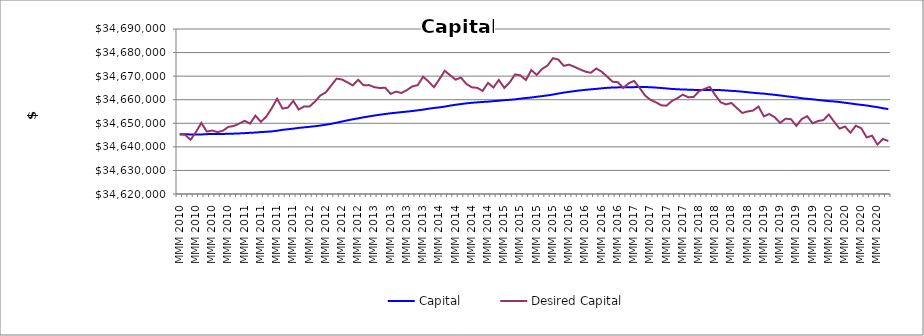
| Category | Capital | Desired Capital |
|---|---|---|
| MMM 2010 | 34645298.422 | 34645298.422 |
| MMM 2010 | 34645298.422 | 34645128.491 |
| MMM 2010 | 34645293.702 | 34642982.798 |
| MMM 2010 | 34645229.51 | 34646280.02 |
| MMM 2010 | 34645258.691 | 34650183.664 |
| MMM 2010 | 34645395.496 | 34646485.161 |
| MMM 2010 | 34645425.764 | 34646929.41 |
| MMM 2010 | 34645467.532 | 34646263.54 |
| MMM 2010 | 34645489.643 | 34646864.684 |
| MMM 2010 | 34645527.839 | 34648481.085 |
| MMM 2010 | 34645609.873 | 34648855.1 |
| MMM 2010 | 34645700.019 | 34649867.607 |
| MMM 2011 | 34645815.785 | 34651049.634 |
| MMM 2011 | 34645961.17 | 34649869.801 |
| MMM 2011 | 34646069.743 | 34653249.377 |
| MMM 2011 | 34646269.177 | 34650607.617 |
| MMM 2011 | 34646389.689 | 34652809.703 |
| MMM 2011 | 34646568.023 | 34656338.591 |
| MMM 2011 | 34646839.428 | 34660429.334 |
| MMM 2011 | 34647216.925 | 34656244.126 |
| MMM 2011 | 34647467.681 | 34656637.115 |
| MMM 2011 | 34647722.387 | 34659514.752 |
| MMM 2011 | 34648049.953 | 34655840.358 |
| MMM 2011 | 34648266.353 | 34657139.008 |
| MMM 2012 | 34648512.816 | 34657108.351 |
| MMM 2012 | 34648751.58 | 34659202.632 |
| MMM 2012 | 34649041.887 | 34661801.72 |
| MMM 2012 | 34649396.327 | 34663089.624 |
| MMM 2012 | 34649776.697 | 34666015.426 |
| MMM 2012 | 34650227.772 | 34668937.724 |
| MMM 2012 | 34650747.493 | 34668574.208 |
| MMM 2012 | 34651242.68 | 34667390.611 |
| MMM 2012 | 34651691.233 | 34666067.803 |
| MMM 2012 | 34652090.583 | 34668438.253 |
| MMM 2012 | 34652544.685 | 34666102.008 |
| MMM 2012 | 34652921.277 | 34666207.002 |
| MMM 2013 | 34653290.325 | 34665310.318 |
| MMM 2013 | 34653624.214 | 34664970.948 |
| MMM 2013 | 34653939.401 | 34665080.668 |
| MMM 2013 | 34654248.88 | 34662485.43 |
| MMM 2013 | 34654477.673 | 34663445.601 |
| MMM 2013 | 34654726.782 | 34662850.014 |
| MMM 2013 | 34654952.428 | 34664077.179 |
| MMM 2013 | 34655205.893 | 34665632.373 |
| MMM 2013 | 34655495.517 | 34666174.793 |
| MMM 2013 | 34655792.164 | 34669755.631 |
| MMM 2013 | 34656180.038 | 34667724.118 |
| MMM 2013 | 34656500.707 | 34665293.195 |
| MMM 2014 | 34656744.943 | 34668651.455 |
| MMM 2014 | 34657075.679 | 34672280.743 |
| MMM 2014 | 34657498.042 | 34670370.632 |
| MMM 2014 | 34657855.614 | 34668512.235 |
| MMM 2014 | 34658151.631 | 34669371.776 |
| MMM 2014 | 34658463.302 | 34666686.207 |
| MMM 2014 | 34658691.716 | 34665255.263 |
| MMM 2014 | 34658874.037 | 34665055.789 |
| MMM 2014 | 34659045.752 | 34663752.429 |
| MMM 2014 | 34659176.493 | 34667144.973 |
| MMM 2014 | 34659397.84 | 34665177.789 |
| MMM 2014 | 34659558.394 | 34668380.713 |
| MMM 2015 | 34659803.458 | 34665006.274 |
| MMM 2015 | 34659947.981 | 34667332.683 |
| MMM 2015 | 34660153.112 | 34670751.392 |
| MMM 2015 | 34660447.508 | 34670309.183 |
| MMM 2015 | 34660721.444 | 34668343.514 |
| MMM 2015 | 34660933.168 | 34672574.861 |
| MMM 2015 | 34661256.548 | 34670539.617 |
| MMM 2015 | 34661514.411 | 34673066.17 |
| MMM 2015 | 34661835.293 | 34674484.453 |
| MMM 2015 | 34662186.659 | 34677612.102 |
| MMM 2015 | 34662615.143 | 34677028.787 |
| MMM 2015 | 34663015.522 | 34674375.708 |
| MMM 2016 | 34663331.083 | 34674876.07 |
| MMM 2016 | 34663651.777 | 34673933.77 |
| MMM 2016 | 34663937.388 | 34672871.066 |
| MMM 2016 | 34664185.546 | 34671924.807 |
| MMM 2016 | 34664400.525 | 34671419.508 |
| MMM 2016 | 34664595.497 | 34673220.692 |
| MMM 2016 | 34664835.086 | 34671911.164 |
| MMM 2016 | 34665031.644 | 34669864.059 |
| MMM 2016 | 34665165.877 | 34667633.641 |
| MMM 2016 | 34665234.426 | 34667425.848 |
| MMM 2016 | 34665295.299 | 34665004.318 |
| MMM 2016 | 34665287.216 | 34666948.387 |
| MMM 2017 | 34665333.36 | 34667985.08 |
| MMM 2017 | 34665407.019 | 34665086.272 |
| MMM 2017 | 34665398.109 | 34661858.665 |
| MMM 2017 | 34665299.791 | 34659998.116 |
| MMM 2017 | 34665152.523 | 34658961.021 |
| MMM 2017 | 34664980.536 | 34657641.981 |
| MMM 2017 | 34664776.688 | 34657467.361 |
| MMM 2017 | 34664573.651 | 34659461.938 |
| MMM 2017 | 34664431.659 | 34660641.928 |
| MMM 2017 | 34664326.389 | 34662156.395 |
| MMM 2017 | 34664266.111 | 34661068.653 |
| MMM 2017 | 34664177.293 | 34661128.037 |
| MMM 2018 | 34664092.591 | 34663562.447 |
| MMM 2018 | 34664077.865 | 34664553.273 |
| MMM 2018 | 34664091.071 | 34665434.604 |
| MMM 2018 | 34664128.391 | 34662000.112 |
| MMM 2018 | 34664069.272 | 34658920.522 |
| MMM 2018 | 34663926.251 | 34657988.739 |
| MMM 2018 | 34663761.32 | 34658631.141 |
| MMM 2018 | 34663618.815 | 34656470.063 |
| MMM 2018 | 34663420.239 | 34654404.62 |
| MMM 2018 | 34663169.805 | 34655004.53 |
| MMM 2018 | 34662942.992 | 34655408.755 |
| MMM 2018 | 34662733.708 | 34657113.388 |
| MMM 2019 | 34662577.588 | 34652930.039 |
| MMM 2019 | 34662309.6 | 34653956.882 |
| MMM 2019 | 34662077.58 | 34652565.345 |
| MMM 2019 | 34661813.351 | 34650151.507 |
| MMM 2019 | 34661489.411 | 34651960.916 |
| MMM 2019 | 34661224.731 | 34651746.671 |
| MMM 2019 | 34660961.451 | 34648909.549 |
| MMM 2019 | 34660626.676 | 34651809.272 |
| MMM 2019 | 34660381.748 | 34653009.9 |
| MMM 2019 | 34660176.975 | 34649999.436 |
| MMM 2019 | 34659894.265 | 34650954.211 |
| MMM 2019 | 34659645.931 | 34651337.669 |
| MMM 2020 | 34659415.146 | 34653738.266 |
| MMM 2020 | 34659257.454 | 34650594.16 |
| MMM 2020 | 34659016.807 | 34647738.622 |
| MMM 2020 | 34658703.524 | 34648614.195 |
| MMM 2020 | 34658423.265 | 34646004.578 |
| MMM 2020 | 34658078.302 | 34648982.951 |
| MMM 2020 | 34657825.653 | 34647892.143 |
| MMM 2020 | 34657549.722 | 34643992.011 |
| MMM 2020 | 34657173.119 | 34644753.952 |
| MMM 2020 | 34656828.142 | 34640969.877 |
| MMM 2020 | 34656387.635 | 34643356.52 |
| MMM 2020 | 34656025.66 | 34642468.155 |